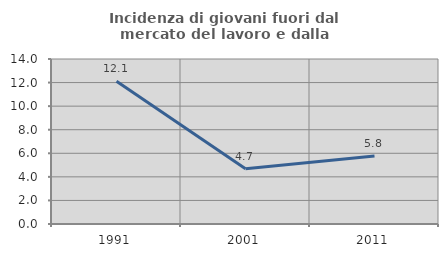
| Category | Incidenza di giovani fuori dal mercato del lavoro e dalla formazione  |
|---|---|
| 1991.0 | 12.121 |
| 2001.0 | 4.688 |
| 2011.0 | 5.769 |